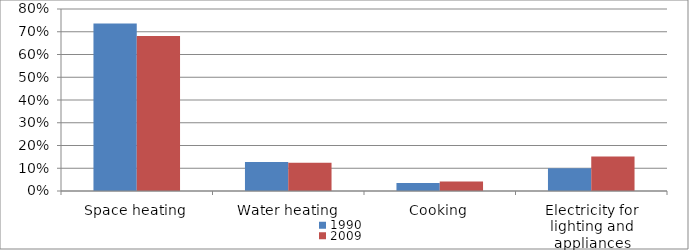
| Category | 1990 | 2009 |
|---|---|---|
| Space heating | 0.737 | 0.682 |
| Water heating | 0.128 | 0.125 |
| Cooking | 0.035 | 0.042 |
| Electricity for lighting and appliances | 0.1 | 0.152 |